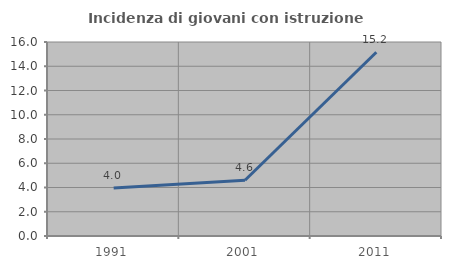
| Category | Incidenza di giovani con istruzione universitaria |
|---|---|
| 1991.0 | 3.955 |
| 2001.0 | 4.598 |
| 2011.0 | 15.152 |